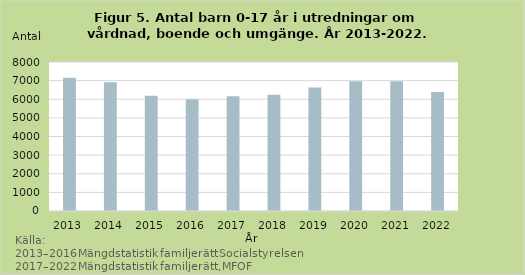
| Category | Vårdnads-, boende-, umgängesutredning |
|---|---|
| 2013.0 | 7157 |
| 2014.0 | 6912 |
| 2015.0 | 6187 |
| 2016.0 | 6006 |
| 2017.0 | 6163 |
| 2018.0 | 6243 |
| 2019.0 | 6637 |
| 2020.0 | 6969 |
| 2021.0 | 6973 |
| 2022.0 | 6393 |